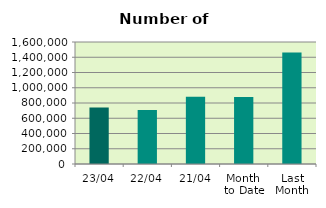
| Category | Series 0 |
|---|---|
| 23/04 | 742234 |
| 22/04 | 708402 |
| 21/04 | 880998 |
| Month 
to Date | 879928.8 |
| Last
Month | 1462822.818 |